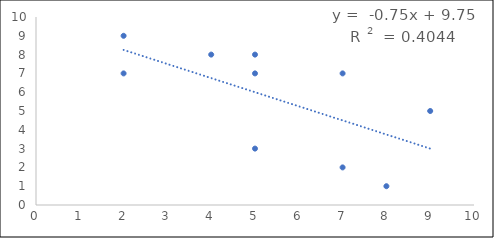
| Category | Series 0 |
|---|---|
| 8.0 | 1 |
| 7.0 | 2 |
| 4.0 | 8 |
| 9.0 | 5 |
| 5.0 | 3 |
| 5.0 | 7 |
| 2.0 | 7 |
| 5.0 | 8 |
| 2.0 | 9 |
| 7.0 | 7 |